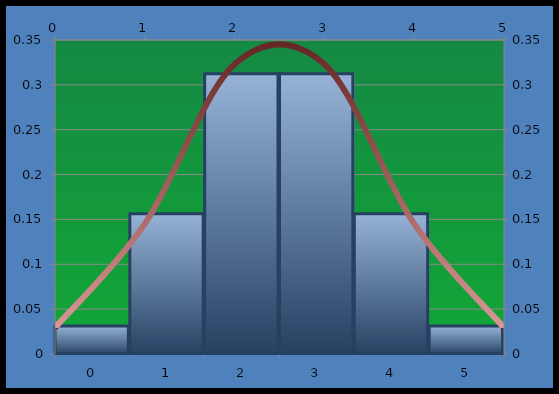
| Category | p(k) |
|---|---|
| 0.0 | 0.031 |
| 1.0 | 0.156 |
| 2.0 | 0.313 |
| 3.0 | 0.313 |
| 4.0 | 0.156 |
| 5.0 | 0.031 |